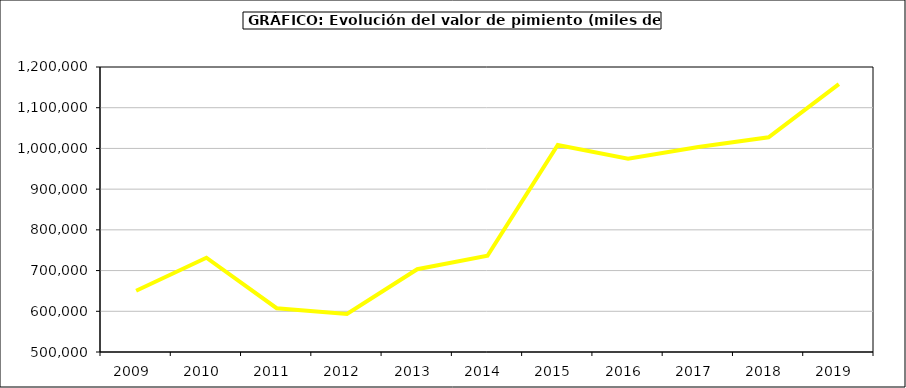
| Category | Valor |
|---|---|
| 2009.0 | 650428.968 |
| 2010.0 | 731583.218 |
| 2011.0 | 607528.309 |
| 2012.0 | 593530.063 |
| 2013.0 | 703328.169 |
| 2014.0 | 736417.986 |
| 2015.0 | 1008587 |
| 2016.0 | 974815 |
| 2017.0 | 1003610.326 |
| 2018.0 | 1027423.396 |
| 2019.0 | 1158111.218 |